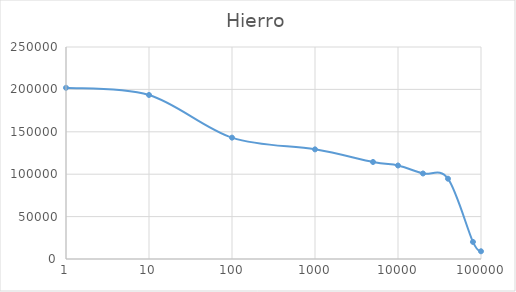
| Category | Hierro |
|---|---|
| 1.0 | 201887.58 |
| 10.0 | 193424.294 |
| 100.0 | 143101.146 |
| 1000.0 | 129295.402 |
| 5000.0 | 114411.637 |
| 10000.0 | 110254.62 |
| 20000.0 | 100845.312 |
| 40000.0 | 94700.524 |
| 80000.0 | 20131.23 |
| 100000.0 | 9103.895 |